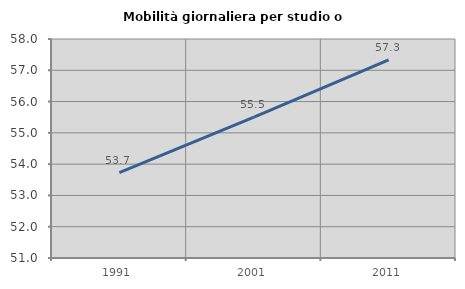
| Category | Mobilità giornaliera per studio o lavoro |
|---|---|
| 1991.0 | 53.728 |
| 2001.0 | 55.5 |
| 2011.0 | 57.335 |